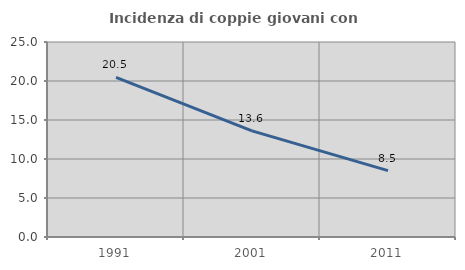
| Category | Incidenza di coppie giovani con figli |
|---|---|
| 1991.0 | 20.467 |
| 2001.0 | 13.609 |
| 2011.0 | 8.507 |